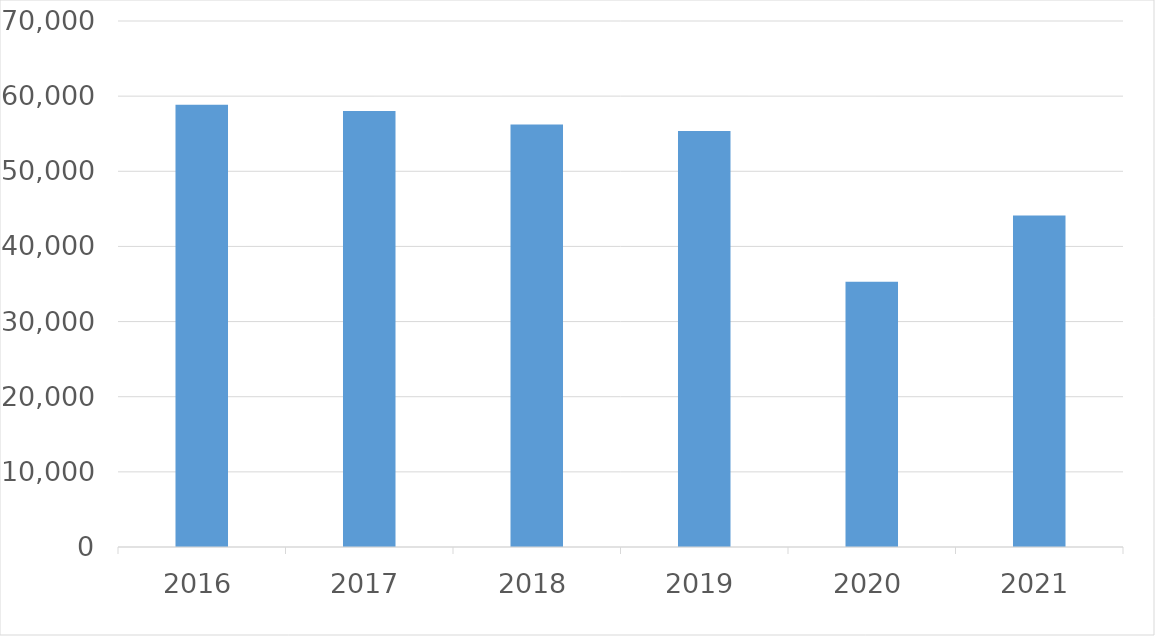
| Category | Series 0 |
|---|---|
| 2016 | 58861 |
| 2017 | 58025 |
| 2018 | 56231 |
| 2019 | 55353 |
| 2020 | 35315 |
| 2021 | 44124 |